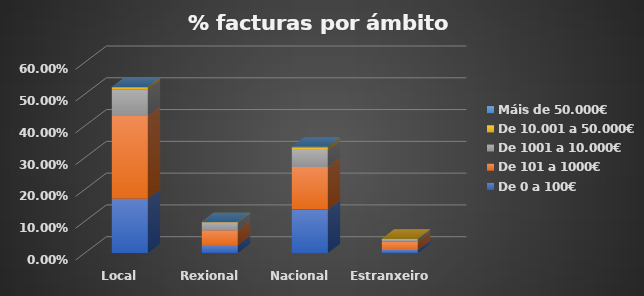
| Category | De 0 a 100€ | De 101 a 1000€ | De 1001 a 10.000€ | De 10.001 a 50.000€ | Máis de 50.000€ |
|---|---|---|---|---|---|
| Local | 0.171 | 0.26 | 0.084 | 0.007 | 0 |
| Rexional | 0.025 | 0.046 | 0.025 | 0.001 | 0 |
| Nacional | 0.137 | 0.134 | 0.053 | 0.008 | 0.002 |
| Estranxeiro | 0.01 | 0.026 | 0.009 | 0.001 | 0 |